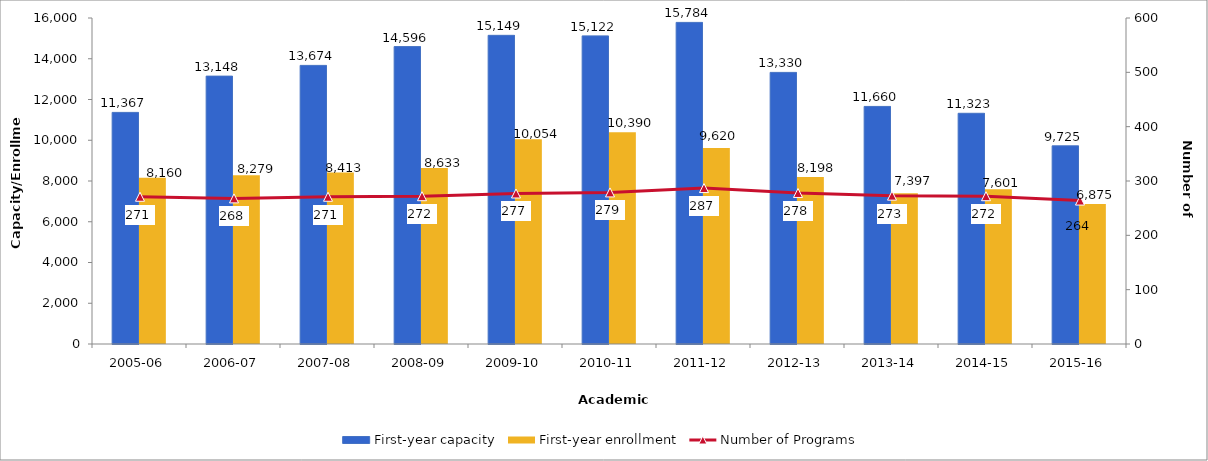
| Category | First-year capacity | First-year enrollment |
|---|---|---|
| 2005-06 | 11367 | 8160 |
| 2006-07 | 13148 | 8279 |
| 2007-08 | 13674 | 8413 |
| 2008-09 | 14596 | 8633 |
| 2009-10 | 15149 | 10054 |
| 2010-11 | 15122 | 10390 |
| 2011-12 | 15784 | 9620 |
| 2012-13 | 13330 | 8198 |
| 2013-14 | 11660 | 7397 |
| 2014-15 | 11323 | 7601 |
| 2015-16 | 9725 | 6875 |